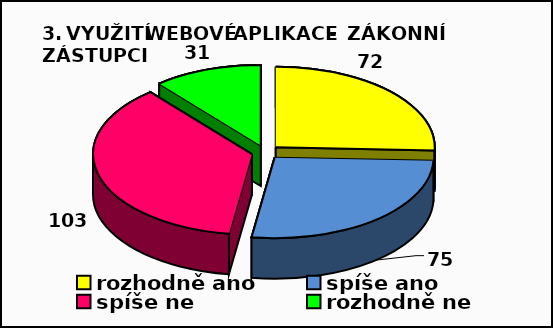
| Category | Series 0 |
|---|---|
| rozhodně ano | 72 |
| spíše ano | 75 |
| spíše ne | 103 |
| rozhodně ne  | 31 |